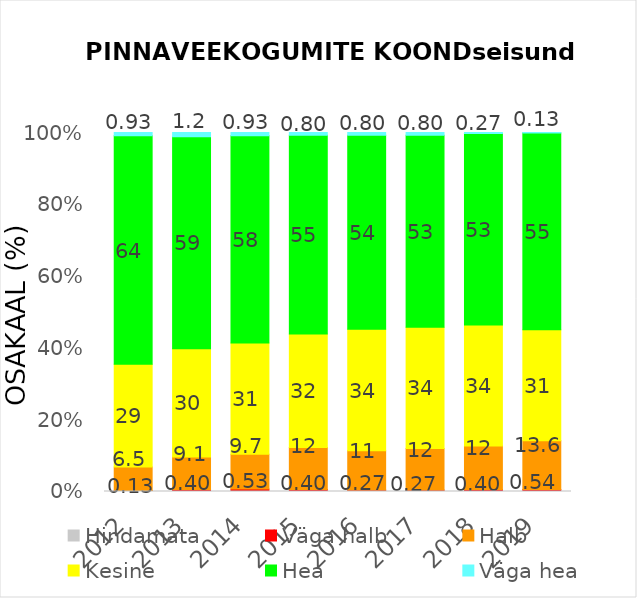
| Category | Hindamata | Väga halb | Halb | Kesine | Hea | Väga hea |
|---|---|---|---|---|---|---|
| 2012.0 | 0.133 | 0.133 | 6.533 | 28.667 | 63.6 | 0.933 |
| 2013.0 | 0.133 | 0.4 | 9.067 | 30.133 | 59.067 | 1.2 |
| 2014.0 | 0.133 | 0.533 | 9.733 | 30.933 | 57.733 | 0.933 |
| 2015.0 | 0.133 | 0.4 | 11.733 | 31.6 | 55.333 | 0.8 |
| 2016.0 | 0.133 | 0.267 | 10.933 | 33.867 | 54 | 0.8 |
| 2017.0 | 0.133 | 0.267 | 11.6 | 33.733 | 53.467 | 0.8 |
| 2018.0 | 0.133 | 0.4 | 12.133 | 33.733 | 53.333 | 0.267 |
| 2019.0 | 0 | 0.538 | 13.575 | 30.914 | 54.839 | 0.134 |